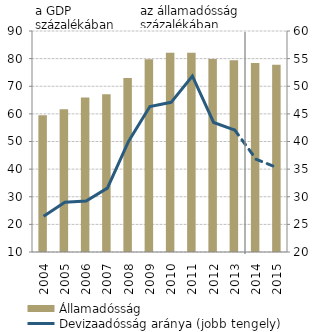
| Category | Államadósság |
|---|---|
| 2004.0 | 59.503 |
| 2005.0 | 61.687 |
| 2006.0 | 65.914 |
| 2007.0 | 67.062 |
| 2008.0 | 72.991 |
| 2009.0 | 79.799 |
| 2010.0 | 82.158 |
| 2011.0 | 82.134 |
| 2012.0 | 79.893 |
| 2013.0 | 79.38 |
| 2014.0 | 78.43 |
| 2015.0 | 77.81 |